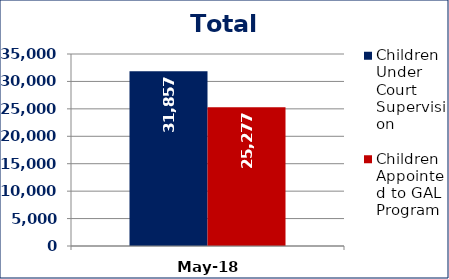
| Category | Children Under Court Supervision  | Children Appointed to GAL Program  |
|---|---|---|
| May-18 | 31857 | 25277 |